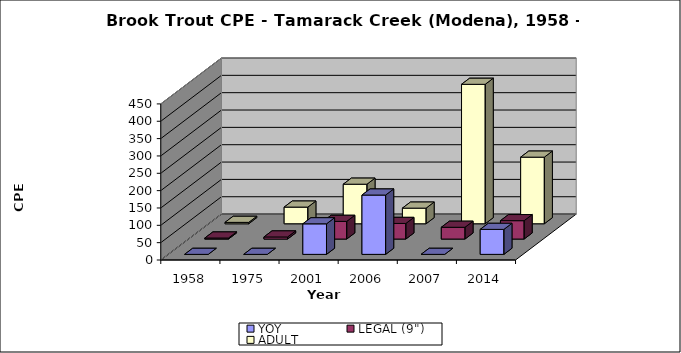
| Category | YOY | LEGAL (9") | ADULT |
|---|---|---|---|
| 1958.0 | 0 | 3 | 4 |
| 1975.0 | 0 | 6 | 48 |
| 2001.0 | 88 | 51 | 114 |
| 2006.0 | 171 | 45 | 45 |
| 2007.0 | 0 | 34 | 402 |
| 2014.0 | 72 | 53 | 192 |